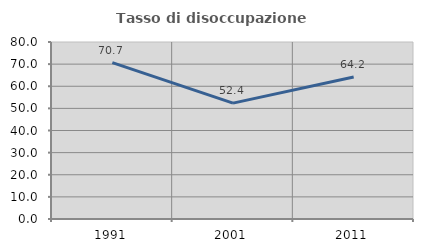
| Category | Tasso di disoccupazione giovanile  |
|---|---|
| 1991.0 | 70.659 |
| 2001.0 | 52.381 |
| 2011.0 | 64.151 |